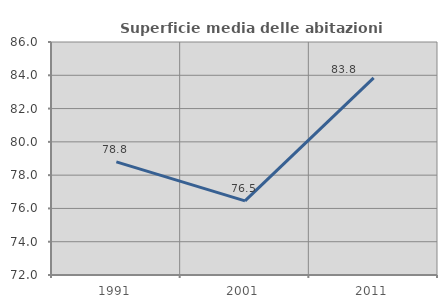
| Category | Superficie media delle abitazioni occupate |
|---|---|
| 1991.0 | 78.795 |
| 2001.0 | 76.451 |
| 2011.0 | 83.845 |